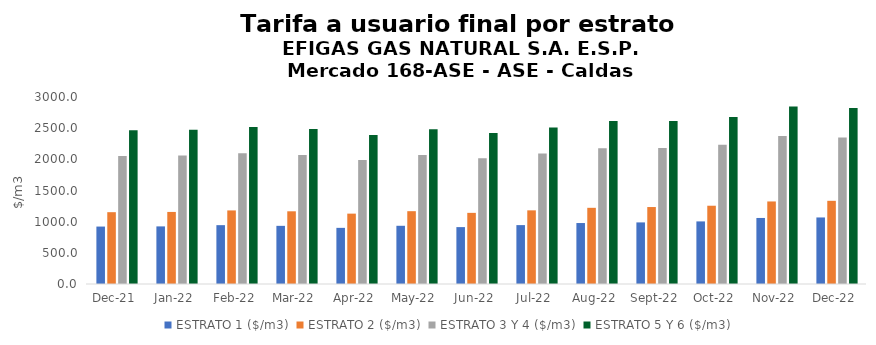
| Category | ESTRATO 1 ($/m3) | ESTRATO 2 ($/m3) | ESTRATO 3 Y 4 ($/m3) | ESTRATO 5 Y 6 ($/m3) |
|---|---|---|---|---|
| 2021-12-01 | 921.46 | 1152.18 | 2054.23 | 2465.076 |
| 2022-01-01 | 924.14 | 1156.04 | 2062.48 | 2474.976 |
| 2022-02-01 | 944.04 | 1180.34 | 2097.94 | 2517.528 |
| 2022-03-01 | 932.97 | 1166.33 | 2071.37 | 2485.644 |
| 2022-04-01 | 900.71 | 1128.96 | 1991.18 | 2389.416 |
| 2022-05-01 | 934.06 | 1168.18 | 2068.29 | 2481.948 |
| 2022-06-01 | 912.8 | 1141.29 | 2017.99 | 2421.588 |
| 2022-07-01 | 944.85 | 1181.63 | 2092.55 | 2511.06 |
| 2022-08-01 | 978.13 | 1222.23 | 2179.73 | 2615.676 |
| 2022-09-01 | 988.13 | 1234.73 | 2180.8 | 2616.96 |
| 2022-10-01 | 1004.17 | 1255.69 | 2233.24 | 2679.888 |
| 2022-11-01 | 1059.41 | 1324.26 | 2374.06 | 2848.872 |
| 2022-12-01 | 1067.55 | 1334.45 | 2351.81 | 2822.172 |